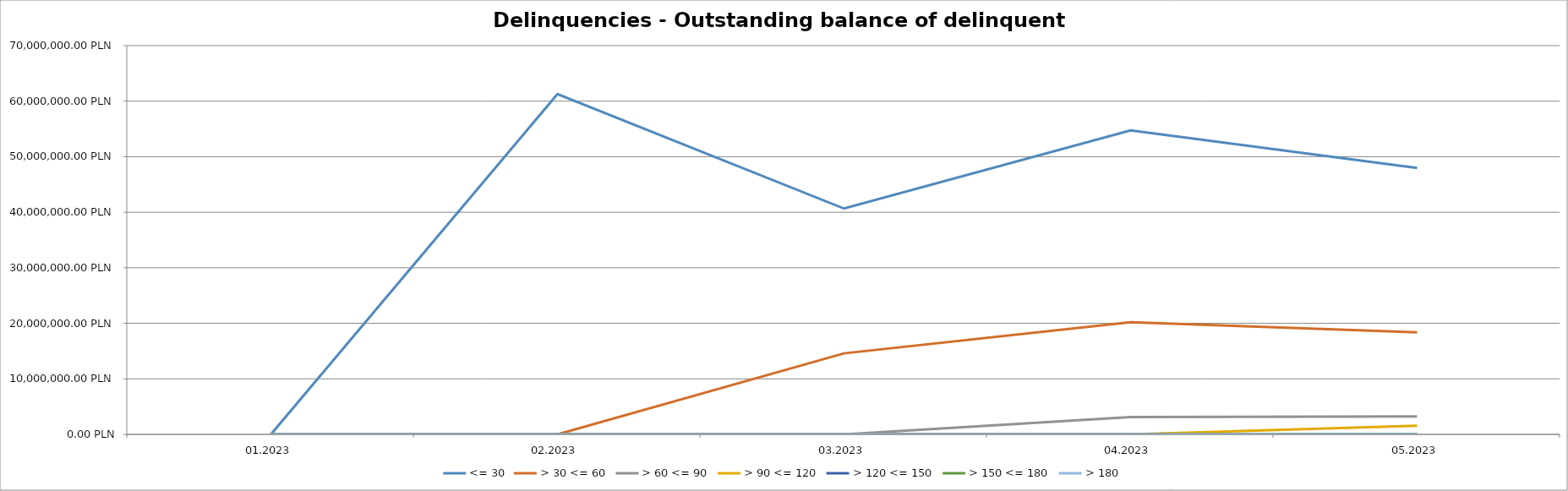
| Category | <= 30 | > 30 <= 60 | > 60 <= 90 | > 90 <= 120 | > 120 <= 150 | > 150 <= 180 | > 180 |
|---|---|---|---|---|---|---|---|
| 01.2023 | 0 | 0 | 0 | 0 | 0 | 0 | 0 |
| 02.2023 | 61279332.52 | 0 | 0 | 0 | 0 | 0 | 0 |
| 03.2023 | 40663789.15 | 14592814.21 | 0 | 0 | 0 | 0 | 0 |
| 04.2023 | 54729258.98 | 20207986.71 | 3105470.81 | 0 | 0 | 0 | 0 |
| 05.2023 | 47980491.52 | 18365026.23 | 3236930.39 | 1575049.71 | 0 | 0 | 0 |